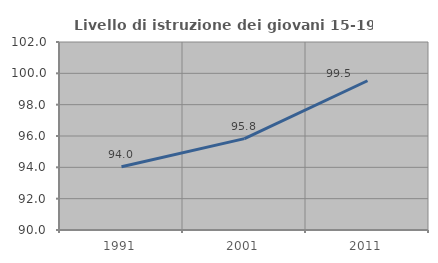
| Category | Livello di istruzione dei giovani 15-19 anni |
|---|---|
| 1991.0 | 94.04 |
| 2001.0 | 95.833 |
| 2011.0 | 99.526 |